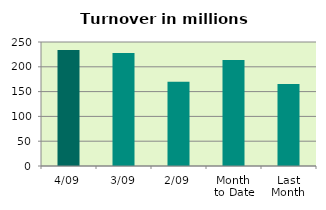
| Category | Series 0 |
|---|---|
| 4/09 | 233.709 |
| 3/09 | 227.723 |
| 2/09 | 170.099 |
| Month 
to Date | 213.815 |
| Last
Month | 165.075 |